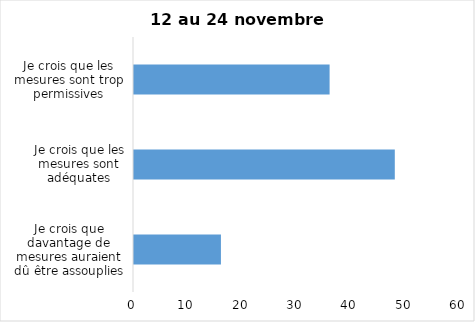
| Category | Series 0 |
|---|---|
| Je crois que davantage de mesures auraient dû être assouplies | 16 |
| Je crois que les mesures sont adéquates | 48 |
| Je crois que les mesures sont trop permissives | 36 |